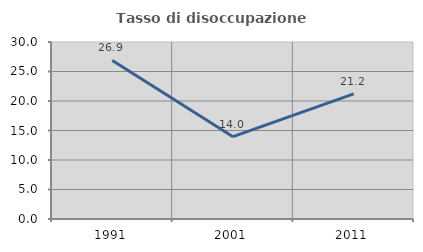
| Category | Tasso di disoccupazione giovanile  |
|---|---|
| 1991.0 | 26.866 |
| 2001.0 | 13.953 |
| 2011.0 | 21.212 |